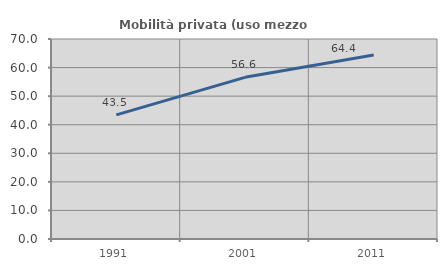
| Category | Mobilità privata (uso mezzo privato) |
|---|---|
| 1991.0 | 43.451 |
| 2001.0 | 56.587 |
| 2011.0 | 64.391 |